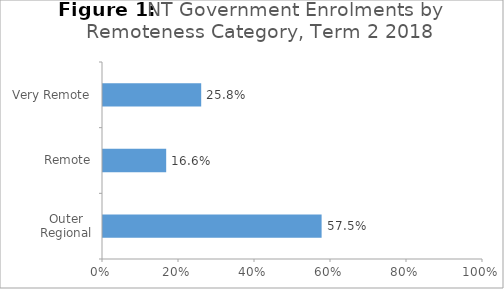
| Category | Term 2 |
|---|---|
| Outer Regional | 0.575 |
| Remote | 0.166 |
| Very Remote | 0.258 |